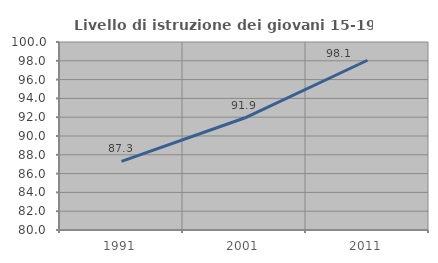
| Category | Livello di istruzione dei giovani 15-19 anni |
|---|---|
| 1991.0 | 87.302 |
| 2001.0 | 91.912 |
| 2011.0 | 98.058 |